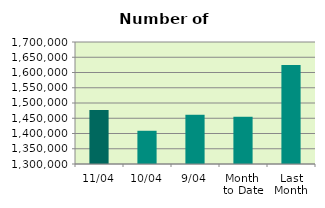
| Category | Series 0 |
|---|---|
| 11/04 | 1476916 |
| 10/04 | 1408930 |
| 9/04 | 1461416 |
| Month 
to Date | 1454863.778 |
| Last
Month | 1624932.286 |